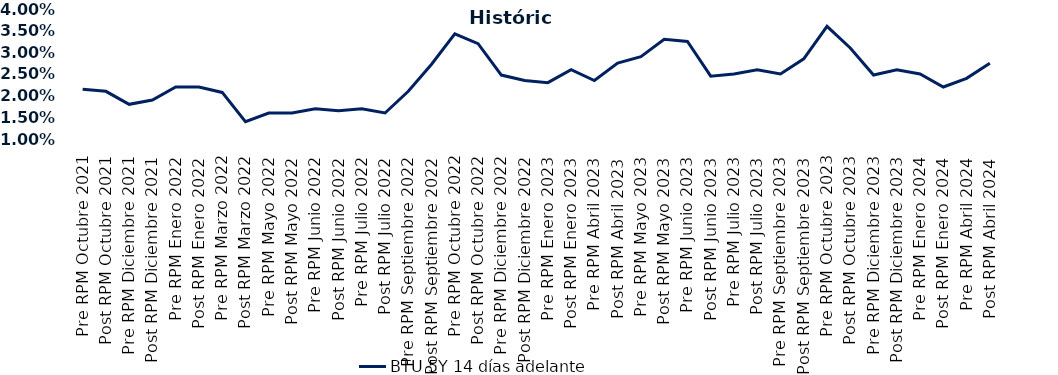
| Category | BTU 5Y 14 días adelante |
|---|---|
| Pre RPM Octubre 2021 | 0.022 |
| Post RPM Octubre 2021 | 0.021 |
| Pre RPM Diciembre 2021 | 0.018 |
| Post RPM Diciembre 2021 | 0.019 |
| Pre RPM Enero 2022 | 0.022 |
| Post RPM Enero 2022 | 0.022 |
| Pre RPM Marzo 2022 | 0.021 |
| Post RPM Marzo 2022 | 0.014 |
| Pre RPM Mayo 2022 | 0.016 |
| Post RPM Mayo 2022 | 0.016 |
| Pre RPM Junio 2022 | 0.017 |
| Post RPM Junio 2022 | 0.016 |
| Pre RPM Julio 2022 | 0.017 |
| Post RPM Julio 2022 | 0.016 |
| Pre RPM Septiembre 2022 | 0.021 |
| Post RPM Septiembre 2022 | 0.027 |
| Pre RPM Octubre 2022 | 0.034 |
| Post RPM Octubre 2022 | 0.032 |
| Pre RPM Diciembre 2022 | 0.025 |
| Post RPM Diciembre 2022 | 0.024 |
| Pre RPM Enero 2023 | 0.023 |
| Post RPM Enero 2023 | 0.026 |
| Pre RPM Abril 2023 | 0.024 |
| Post RPM Abril 2023 | 0.028 |
| Pre RPM Mayo 2023 | 0.029 |
| Post RPM Mayo 2023 | 0.033 |
| Pre RPM Junio 2023 | 0.032 |
| Post RPM Junio 2023 | 0.024 |
| Pre RPM Julio 2023 | 0.025 |
| Post RPM Julio 2023 | 0.026 |
| Pre RPM Septiembre 2023 | 0.025 |
| Post RPM Septiembre 2023 | 0.028 |
| Pre RPM Octubre 2023 | 0.036 |
| Post RPM Octubre 2023 | 0.031 |
| Pre RPM Diciembre 2023 | 0.025 |
| Post RPM Diciembre 2023 | 0.026 |
| Pre RPM Enero 2024 | 0.025 |
| Post RPM Enero 2024 | 0.022 |
| Pre RPM Abril 2024 | 0.024 |
| Post RPM Abril 2024 | 0.028 |